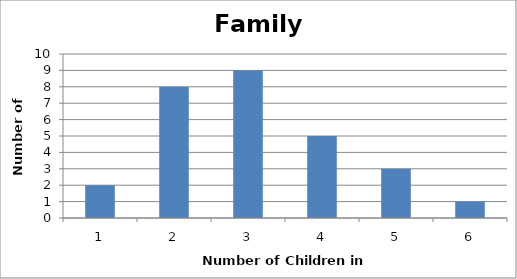
| Category | Series 0 |
|---|---|
| 1.0 | 2 |
| 2.0 | 8 |
| 3.0 | 9 |
| 4.0 | 5 |
| 5.0 | 3 |
| 6.0 | 1 |